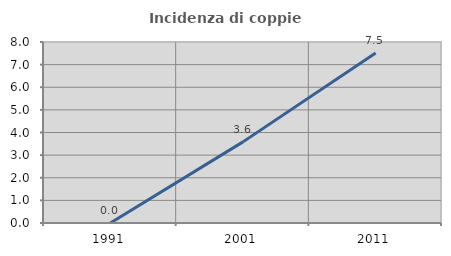
| Category | Incidenza di coppie miste |
|---|---|
| 1991.0 | 0 |
| 2001.0 | 3.586 |
| 2011.0 | 7.514 |